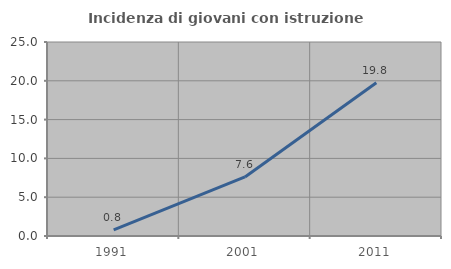
| Category | Incidenza di giovani con istruzione universitaria |
|---|---|
| 1991.0 | 0.781 |
| 2001.0 | 7.606 |
| 2011.0 | 19.751 |